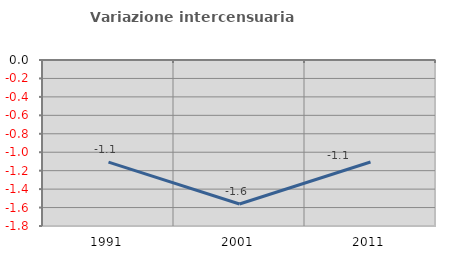
| Category | Variazione intercensuaria annua |
|---|---|
| 1991.0 | -1.107 |
| 2001.0 | -1.561 |
| 2011.0 | -1.106 |